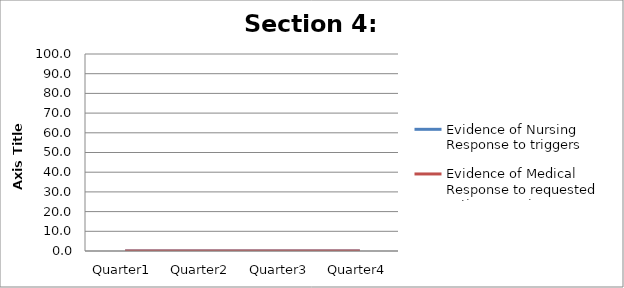
| Category | Evidence of Nursing Response to triggers | Evidence of Medical Response to requested action or review |
|---|---|---|
| Quarter1 | 0 | 0 |
| Quarter2 | 0 | 0 |
| Quarter3 | 0 | 0 |
| Quarter4 | 0 | 0 |